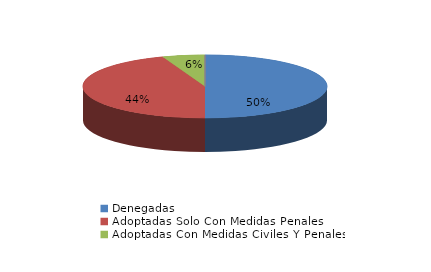
| Category | Series 0 |
|---|---|
| Denegadas | 80 |
| Adoptadas Solo Con Medidas Penales | 71 |
| Adoptadas Con Medidas Civiles Y Penales | 9 |
| Adoptadas Con Medidas Solo Civiles | 0 |